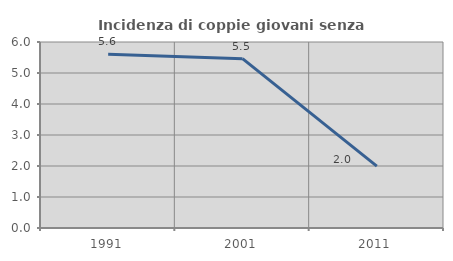
| Category | Incidenza di coppie giovani senza figli |
|---|---|
| 1991.0 | 5.604 |
| 2001.0 | 5.462 |
| 2011.0 | 1.997 |